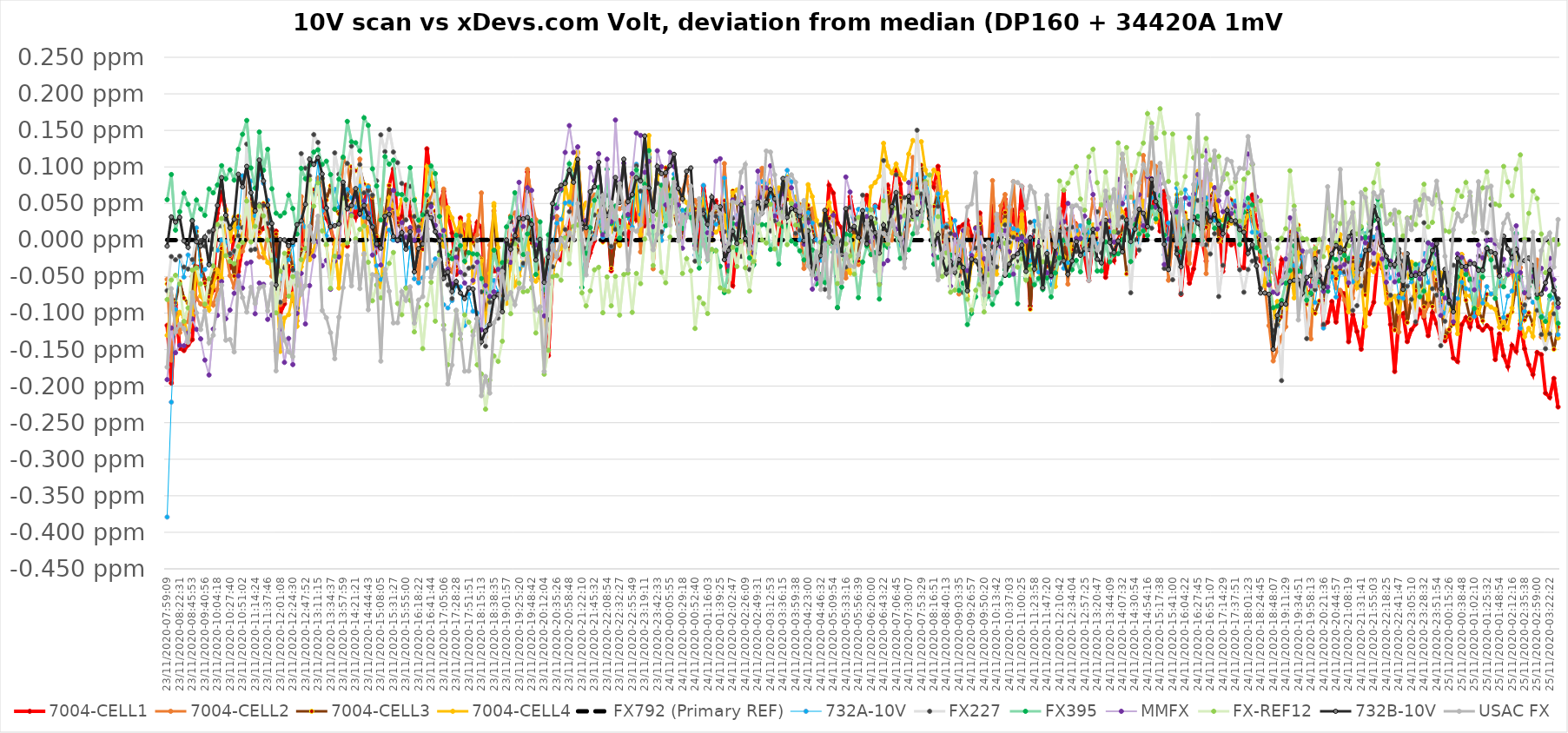
| Category | 7004-CELL1 | 7004-CELL2 | 7004-CELL3 | 7004-CELL4 | FX792 (Primary REF) | 732A-10V | FX227 | FX395 | MMFX | FX-REF12 | 732B-10V | USAC FX |
|---|---|---|---|---|---|---|---|---|---|---|---|---|
| 23/11/2020-07:59:09 | -0.117 | -0.054 | -0.06 | -0.131 | 0 | -0.379 | -0.069 | 0.055 | -0.191 | -0.081 | -0.008 | -0.174 |
| 23/11/2020-08:06:56 | -0.196 | -0.164 | -0.076 | -0.085 | 0 | -0.222 | -0.023 | 0.09 | -0.12 | -0.055 | 0.032 | -0.067 |
| 23/11/2020-08:14:44 | -0.088 | -0.097 | -0.086 | -0.113 | 0 | -0.095 | -0.027 | 0.014 | -0.154 | -0.048 | 0.025 | -0.126 |
| 23/11/2020-08:22:31 | -0.148 | -0.127 | -0.057 | -0.099 | 0 | -0.024 | -0.022 | 0.039 | -0.144 | -0.06 | 0.031 | -0.115 |
| 23/11/2020-08:30:19 | -0.151 | -0.113 | -0.079 | -0.106 | 0 | -0.051 | -0.037 | 0.064 | -0.145 | -0.111 | -0.001 | -0.122 |
| 23/11/2020-08:38:06 | -0.144 | -0.112 | -0.087 | -0.135 | 0 | -0.02 | -0.04 | 0.049 | -0.127 | -0.093 | -0.01 | -0.14 |
| 23/11/2020-08:45:53 | -0.136 | -0.05 | -0.085 | -0.103 | 0 | -0.03 | -0.027 | 0.027 | -0.108 | -0.041 | 0.026 | -0.072 |
| 23/11/2020-09:25:21 | -0.037 | -0.08 | 0.012 | -0.041 | 0 | 0.017 | 0.005 | 0.055 | -0.122 | -0.038 | -0.002 | -0.1 |
| 23/11/2020-09:33:08 | -0.036 | -0.087 | -0.028 | -0.077 | 0 | -0.049 | -0.001 | 0.042 | -0.135 | -0.06 | -0.008 | -0.123 |
| 23/11/2020-09:40:56 | -0.055 | -0.091 | -0.059 | -0.087 | 0 | -0.04 | -0.008 | 0.034 | -0.164 | -0.088 | 0.004 | -0.097 |
| 23/11/2020-09:48:43 | -0.083 | -0.078 | -0.078 | -0.096 | 0 | -0.032 | 0.011 | 0.07 | -0.185 | -0.053 | -0.034 | -0.141 |
| 23/11/2020-09:56:30 | -0.069 | -0.089 | -0.039 | -0.064 | 0 | -0.006 | -0.013 | 0.065 | -0.122 | -0.036 | 0.014 | -0.13 |
| 23/11/2020-10:04:18 | 0.037 | -0.068 | -0.051 | -0.041 | 0 | -0.014 | 0.018 | 0.075 | -0.103 | 0.021 | 0.047 | -0.082 |
| 23/11/2020-10:12:05 | 0.065 | -0.006 | -0.011 | -0.052 | 0 | 0 | 0.019 | 0.102 | -0.057 | 0.03 | 0.085 | -0.062 |
| 23/11/2020-10:19:53 | 0.04 | -0.016 | -0.022 | 0.041 | 0 | -0.002 | 0.028 | 0.084 | -0.108 | -0.022 | 0.034 | -0.137 |
| 23/11/2020-10:27:40 | -0.038 | -0.049 | -0.022 | -0.002 | 0 | -0.02 | -0.019 | 0.096 | -0.096 | -0.029 | 0.017 | -0.136 |
| 23/11/2020-10:35:27 | 0.004 | -0.065 | -0.049 | 0.031 | 0 | -0.016 | -0.015 | 0.082 | -0.073 | -0.032 | 0.028 | -0.153 |
| 23/11/2020-10:43:15 | -0.043 | -0.021 | 0.033 | -0.024 | 0 | 0.017 | 0.006 | 0.124 | -0.049 | -0.009 | 0.09 | -0.058 |
| 23/11/2020-10:51:02 | -0.008 | -0.015 | 0.004 | 0.025 | 0 | 0.088 | 0.017 | 0.145 | -0.066 | -0.003 | 0.073 | -0.079 |
| 23/11/2020-10:58:49 | 0.028 | 0.002 | 0.087 | 0.055 | 0 | 0.091 | 0.131 | 0.164 | -0.032 | 0.053 | 0.101 | -0.099 |
| 23/11/2020-11:06:37 | 0.044 | 0.057 | 0.056 | 0.041 | 0 | 0.081 | -0.014 | 0.099 | -0.03 | -0.003 | 0.065 | -0.065 |
| 23/11/2020-11:14:24 | 0.042 | 0 | 0.033 | 0.001 | 0 | 0.033 | -0.013 | 0.071 | -0.101 | 0.019 | 0.04 | -0.087 |
| 23/11/2020-11:22:12 | 0.01 | -0.023 | 0.011 | 0.002 | 0 | 0.089 | 0.049 | 0.148 | -0.059 | 0.046 | 0.109 | -0.066 |
| 23/11/2020-11:29:59 | 0.016 | -0.024 | 0.05 | -0.018 | 0 | 0.078 | 0.047 | 0.095 | -0.061 | 0.033 | 0.081 | -0.063 |
| 23/11/2020-11:37:46 | 0.023 | 0.012 | 0.045 | -0.031 | 0 | 0.054 | 0.023 | 0.124 | -0.109 | 0 | 0.048 | -0.097 |
| 23/11/2020-11:45:34 | -0.015 | -0.049 | -0.015 | -0.037 | 0 | 0 | 0.015 | 0.07 | -0.103 | -0.028 | 0.023 | -0.06 |
| 23/11/2020-11:53:21 | 0.012 | -0.031 | 0.008 | -0.05 | 0 | -0.028 | -0.066 | 0.037 | -0.152 | -0.1 | -0.061 | -0.179 |
| 23/11/2020-12:01:08 | -0.1 | -0.088 | -0.069 | -0.152 | 0 | -0.053 | -0.085 | 0.033 | -0.122 | -0.043 | 0.001 | -0.104 |
| 23/11/2020-12:08:56 | -0.087 | -0.083 | -0.036 | -0.107 | 0 | -0.04 | -0.038 | 0.037 | -0.168 | -0.018 | 0 | -0.137 |
| 23/11/2020-12:16:43 | -0.036 | -0.008 | -0.017 | -0.102 | 0 | -0.027 | -0.066 | 0.061 | -0.135 | -0.077 | -0.008 | -0.153 |
| 23/11/2020-12:24:30 | -0.083 | -0.035 | -0.038 | -0.074 | 0 | -0.007 | -0.041 | 0.043 | -0.17 | -0.05 | -0.003 | -0.16 |
| 23/11/2020-12:32:18 | -0.09 | -0.111 | -0.081 | -0.118 | 0 | -0.077 | -0.093 | 0.008 | -0.1 | -0.062 | 0.021 | -0.046 |
| 23/11/2020-12:40:05 | 0.018 | 0.059 | -0.012 | -0.037 | 0 | 0.031 | 0.118 | 0.098 | -0.046 | -0.027 | 0.026 | -0.074 |
| 23/11/2020-12:47:52 | -0.015 | -0.005 | -0.021 | -0.021 | 0 | 0.018 | 0.098 | 0.084 | -0.115 | -0.012 | 0.049 | -0.062 |
| 23/11/2020-12:55:40 | -0.017 | -0.022 | -0.026 | -0.027 | 0 | 0.019 | 0.088 | 0.102 | -0.062 | 0.083 | 0.111 | 0.019 |
| 23/11/2020-13:03:27 | 0.066 | 0.061 | 0.069 | -0.014 | 0 | 0.055 | 0.144 | 0.12 | -0.022 | 0.046 | 0.103 | -0.003 |
| 23/11/2020-13:11:15 | 0.066 | 0.085 | 0.073 | 0.024 | 0 | 0.107 | 0.134 | 0.123 | -0.002 | 0.078 | 0.113 | 0.033 |
| 23/11/2020-13:19:02 | 0.051 | 0.075 | 0.084 | 0.03 | 0 | 0.04 | 0.085 | 0.103 | -0.035 | 0.012 | 0.09 | -0.096 |
| 23/11/2020-13:26:49 | 0.03 | 0.036 | 0.055 | -0.007 | 0 | 0.006 | 0.044 | 0.108 | -0.028 | -0.006 | 0.044 | -0.106 |
| 23/11/2020-13:34:37 | 0.017 | 0.021 | 0.074 | -0.05 | 0 | 0.023 | 0.018 | 0.09 | -0.067 | -0.066 | 0.018 | -0.127 |
| 23/11/2020-13:42:24 | -0.006 | -0.013 | 0.042 | -0.002 | 0 | 0.069 | 0.119 | 0.042 | -0.029 | -0.022 | 0.02 | -0.162 |
| 23/11/2020-13:50:11 | 0.006 | -0.022 | 0.036 | -0.066 | 0 | 0.045 | 0.09 | 0.083 | -0.023 | 0.025 | 0.022 | -0.105 |
| 23/11/2020-13:57:59 | 0.069 | 0.111 | 0.061 | -0.007 | 0 | 0.038 | 0.075 | 0.113 | 0.063 | 0.057 | 0.079 | -0.065 |
| 23/11/2020-14:05:46 | -0.009 | 0.102 | 0.054 | -0.003 | 0 | 0.069 | 0.105 | 0.162 | 0.044 | -0.004 | 0.043 | -0.021 |
| 23/11/2020-14:13:33 | 0.048 | 0.067 | 0.1 | 0.043 | 0 | 0.058 | 0.128 | 0.134 | 0.035 | 0.033 | 0.047 | -0.063 |
| 23/11/2020-14:21:21 | 0.031 | 0.046 | 0.095 | 0.053 | 0 | 0.045 | 0.063 | 0.133 | 0.06 | 0.002 | 0.07 | -0.003 |
| 23/11/2020-14:29:08 | 0.06 | 0.111 | 0.098 | 0.084 | 0 | 0.074 | 0.103 | 0.122 | 0.035 | 0.015 | 0.036 | -0.066 |
| 23/11/2020-14:36:56 | 0.05 | 0.004 | 0.077 | -0.02 | 0 | 0.031 | 0.065 | 0.167 | 0.054 | 0.019 | 0.047 | -0.019 |
| 23/11/2020-14:44:43 | 0.074 | 0.046 | 0.074 | 0.017 | 0 | 0.072 | 0.067 | 0.157 | 0.037 | -0.03 | 0.03 | -0.095 |
| 23/11/2020-14:52:30 | 0.033 | 0.016 | 0.059 | 0.002 | 0 | 0.019 | 0.061 | 0.097 | -0.021 | -0.083 | 0.018 | -0.047 |
| 23/11/2020-15:00:18 | -0.015 | 0.006 | 0.004 | -0.047 | 0 | -0.035 | 0.081 | 0.074 | -0.008 | -0.061 | -0.005 | -0.049 |
| 23/11/2020-15:08:05 | -0.004 | 0.054 | -0.001 | -0.064 | 0 | -0.054 | 0.144 | 0.027 | -0.034 | -0.079 | -0.011 | -0.166 |
| 23/11/2020-15:15:52 | 0.01 | 0.024 | 0.034 | 0.007 | 0.001 | -0.046 | 0.121 | 0.114 | 0.022 | -0.047 | 0.033 | -0.04 |
| 23/11/2020-15:23:40 | 0.075 | 0.049 | 0.075 | 0.058 | 0 | 0.014 | 0.151 | 0.104 | 0.042 | -0.032 | 0.035 | -0.07 |
| 23/11/2020-15:31:27 | 0.097 | 0.033 | 0.043 | 0.047 | 0 | 0 | 0.12 | 0.109 | 0.068 | -0.017 | 0.005 | -0.113 |
| 23/11/2020-15:39:15 | 0.023 | 0.001 | 0.024 | 0.036 | 0 | -0.001 | 0.106 | 0.063 | -0.001 | -0.087 | 0 | -0.113 |
| 23/11/2020-15:47:12 | 0.033 | 0.003 | 0.013 | 0.055 | 0 | 0.006 | 0.077 | 0.062 | 0.024 | -0.102 | 0.01 | -0.071 |
| 23/11/2020-15:55:00 | 0.075 | 0.015 | 0.043 | 0.054 | 0 | -0.065 | 0.027 | 0.055 | 0.004 | -0.066 | -0.013 | -0.083 |
| 23/11/2020-16:02:47 | 0.033 | 0.003 | 0.059 | 0.069 | 0 | -0.01 | 0.073 | 0.099 | 0.017 | -0.083 | 0.011 | -0.064 |
| 23/11/2020-16:10:34 | 0.017 | 0.028 | 0.034 | 0.056 | -0.001 | -0.053 | 0.032 | 0.055 | 0 | -0.126 | -0.044 | -0.114 |
| 23/11/2020-16:18:22 | 0.009 | -0.058 | 0.001 | 0.024 | 0 | -0.059 | 0.018 | 0.027 | 0.013 | -0.092 | -0.012 | -0.082 |
| 23/11/2020-16:26:09 | 0.038 | 0.022 | -0.013 | 0.01 | 0 | -0.052 | 0.003 | 0.034 | 0.002 | -0.149 | -0.005 | -0.077 |
| 23/11/2020-16:33:56 | 0.125 | 0.031 | 0.054 | 0.101 | 0 | -0.038 | 0.039 | 0.062 | 0.015 | -0.089 | 0.034 | 0.03 |
| 23/11/2020-16:41:44 | 0.077 | 0.057 | 0.038 | 0.091 | 0 | -0.036 | 0.049 | 0.101 | 0.046 | -0.058 | 0.03 | -0.051 |
| 23/11/2020-16:49:31 | 0.064 | 0.078 | 0.04 | 0.05 | 0 | -0.026 | 0.068 | 0.091 | 0.02 | -0.111 | 0.011 | -0.033 |
| 23/11/2020-16:57:18 | 0.049 | 0.026 | -0.005 | 0.043 | 0 | -0.037 | -0.017 | 0.032 | 0.006 | -0.02 | -0.001 | -0.027 |
| 23/11/2020-17:05:06 | 0.067 | 0.07 | 0.011 | -0.008 | -0.001 | -0.088 | -0.042 | 0.006 | 0.013 | -0.116 | -0.052 | -0.123 |
| 23/11/2020-17:12:53 | 0.035 | -0.034 | -0.031 | 0.044 | 0 | -0.093 | -0.061 | -0.021 | -0.04 | -0.171 | -0.044 | -0.197 |
| 23/11/2020-17:20:41 | 0.01 | -0.043 | -0.016 | 0.03 | 0 | -0.083 | -0.08 | -0.026 | -0.06 | -0.13 | -0.07 | -0.171 |
| 23/11/2020-17:28:28 | -0.047 | -0.018 | -0.036 | 0.012 | 0 | -0.063 | -0.013 | 0.006 | -0.024 | -0.097 | -0.057 | -0.096 |
| 23/11/2020-17:36:16 | 0.03 | 0.014 | 0.005 | 0.024 | 0 | -0.064 | 0.006 | -0.008 | -0.044 | -0.136 | -0.072 | -0.128 |
| 23/11/2020-17:44:03 | -0.004 | 0.021 | -0.031 | -0.011 | 0 | -0.117 | -0.047 | -0.029 | -0.059 | -0.103 | -0.08 | -0.179 |
| 23/11/2020-17:51:51 | 0.025 | 0.001 | 0.023 | 0.034 | 0 | -0.074 | -0.038 | -0.017 | -0.066 | -0.112 | -0.066 | -0.179 |
| 23/11/2020-17:59:38 | -0.003 | 0.001 | -0.003 | -0.058 | 0 | -0.098 | -0.037 | -0.019 | -0.055 | -0.125 | -0.067 | -0.131 |
| 23/11/2020-18:07:25 | 0.024 | 0.007 | -0.016 | -0.037 | 0 | -0.1 | -0.001 | -0.02 | -0.03 | -0.171 | -0.108 | -0.107 |
| 23/11/2020-18:15:13 | 0.017 | 0.064 | -0.026 | -0.029 | 0 | -0.122 | -0.071 | -0.053 | -0.123 | -0.183 | -0.139 | -0.213 |
| 23/11/2020-18:23:00 | -0.071 | -0.072 | -0.102 | -0.133 | 0 | -0.12 | -0.145 | -0.07 | -0.062 | -0.232 | -0.124 | -0.187 |
| 23/11/2020-18:30:48 | -0.028 | -0.007 | -0.07 | -0.046 | 0 | -0.096 | -0.085 | -0.078 | -0.077 | -0.192 | -0.116 | -0.21 |
| 23/11/2020-18:38:35 | -0.042 | 0.04 | 0.046 | 0.05 | 0 | -0.055 | -0.078 | -0.014 | -0.071 | -0.159 | -0.078 | -0.113 |
| 23/11/2020-18:46:23 | -0.044 | -0.037 | -0.049 | -0.01 | 0 | -0.071 | -0.107 | -0.041 | -0.04 | -0.166 | -0.074 | -0.102 |
| 23/11/2020-18:54:10 | -0.043 | -0.036 | -0.081 | -0.068 | 0 | -0.082 | -0.037 | -0.031 | -0.069 | -0.139 | -0.098 | -0.043 |
| 23/11/2020-19:01:57 | -0.04 | -0.033 | -0.074 | -0.087 | 0 | -0.04 | -0.036 | 0.018 | -0.003 | -0.029 | 0 | -0.08 |
| 23/11/2020-19:09:45 | 0.033 | 0.033 | 0 | -0.026 | 0 | 0.02 | 0.025 | 0.031 | -0.031 | -0.101 | -0.013 | -0.072 |
| 23/11/2020-19:17:32 | -0.019 | 0.037 | -0.027 | -0.062 | 0 | -0.014 | -0.006 | 0.065 | 0.014 | -0.005 | 0.006 | -0.089 |
| 23/11/2020-19:25:20 | 0.025 | -0.001 | -0.008 | -0.049 | 0.001 | -0.04 | 0 | 0.029 | 0.079 | -0.059 | 0.03 | -0.066 |
| 23/11/2020-19:33:07 | 0.037 | 0.028 | -0.03 | -0.028 | 0 | -0.034 | -0.032 | -0.02 | 0.019 | -0.071 | 0.029 | -0.065 |
| 23/11/2020-19:40:54 | 0.093 | 0.097 | 0.03 | 0.006 | 0 | 0.04 | 0.067 | 0.008 | 0.072 | -0.07 | 0.031 | -0.019 |
| 23/11/2020-19:48:42 | 0.041 | 0.056 | -0.004 | -0.05 | 0 | 0.027 | 0.02 | 0.027 | 0.068 | -0.065 | 0.021 | -0.054 |
| 23/11/2020-19:56:29 | -0.003 | 0.028 | -0.019 | -0.056 | 0 | -0.004 | -0.016 | -0.047 | -0.007 | -0.127 | -0.027 | -0.096 |
| 23/11/2020-20:04:17 | -0.012 | -0.013 | -0.052 | -0.044 | 0 | -0.002 | -0.016 | 0.025 | -0.012 | -0.098 | 0.001 | -0.091 |
| 23/11/2020-20:12:04 | -0.032 | -0.078 | -0.079 | -0.135 | 0 | -0.096 | -0.148 | -0.068 | -0.104 | -0.184 | -0.058 | -0.18 |
| 23/11/2020-20:19:51 | -0.158 | -0.053 | -0.114 | -0.079 | 0 | -0.043 | -0.109 | 0.007 | -0.014 | -0.151 | -0.023 | -0.06 |
| 23/11/2020-20:27:39 | -0.04 | -0.04 | -0.046 | -0.048 | 0 | -0.006 | -0.037 | 0.034 | 0.03 | -0.05 | 0.05 | -0.007 |
| 23/11/2020-20:35:26 | -0.023 | 0.032 | -0.017 | -0.019 | 0 | 0.023 | -0.022 | 0.048 | 0.044 | -0.049 | 0.067 | -0.022 |
| 23/11/2020-20:43:13 | -0.027 | -0.002 | -0.009 | -0.011 | 0 | 0.028 | 0.002 | 0.068 | 0.07 | -0.055 | 0.075 | 0.001 |
| 23/11/2020-20:51:01 | -0.003 | 0.017 | -0.004 | 0.078 | 0 | 0.051 | 0.014 | 0.079 | 0.12 | 0.003 | 0.077 | -0.009 |
| 23/11/2020-20:58:48 | 0.017 | 0.001 | -0.015 | 0.048 | 0.001 | 0.052 | 0.039 | 0.104 | 0.157 | -0.032 | 0.095 | 0.01 |
| 23/11/2020-21:06:35 | 0.082 | 0.067 | 0.012 | 0.098 | 0 | 0.049 | 0.016 | 0.086 | 0.12 | 0.019 | 0.079 | 0.001 |
| 23/11/2020-21:14:23 | 0.04 | 0.119 | 0.045 | 0.121 | 0 | 0.089 | 0.1 | 0.098 | 0.127 | 0.021 | 0.11 | 0.05 |
| 23/11/2020-21:22:10 | 0.008 | 0.047 | 0.006 | 0.036 | 0 | -0.044 | 0.015 | -0.065 | 0.026 | -0.072 | 0.023 | 0 |
| 23/11/2020-21:29:58 | -0.036 | -0.004 | -0.017 | 0.051 | 0 | -0.017 | -0.011 | -0.018 | 0.027 | -0.09 | 0.017 | -0.048 |
| 23/11/2020-21:37:45 | -0.018 | 0.057 | -0.001 | 0.047 | 0 | 0.019 | 0.011 | 0.017 | 0.099 | -0.069 | 0.066 | -0.005 |
| 23/11/2020-21:45:32 | -0.001 | 0.062 | 0.01 | 0.05 | 0 | 0.005 | 0.034 | 0.054 | 0.081 | -0.041 | 0.073 | 0.002 |
| 23/11/2020-21:53:20 | 0.032 | 0.066 | 0.04 | 0.024 | 0 | 0.025 | 0.059 | 0.072 | 0.118 | -0.037 | 0.106 | 0.033 |
| 23/11/2020-22:01:07 | 0.005 | 0.061 | -0.003 | 0.002 | 0 | 0.004 | 0.021 | 0.01 | 0.007 | -0.1 | 0.05 | 0.061 |
| 23/11/2020-22:08:54 | 0.047 | 0.06 | 0.034 | 0.04 | 0 | 0.013 | 0.061 | 0.097 | 0.111 | -0.051 | 0.034 | 0.006 |
| 23/11/2020-22:16:52 | -0.042 | 0.017 | -0.039 | 0.012 | 0 | -0.009 | -0.009 | 0.022 | 0.025 | -0.09 | 0.045 | 0.051 |
| 23/11/2020-22:24:39 | 0.014 | 0.043 | 0 | 0.033 | 0 | 0.029 | 0.015 | 0.046 | 0.164 | -0.05 | 0.086 | 0.029 |
| 23/11/2020-22:32:27 | 0.026 | 0.043 | -0.008 | -0.006 | 0 | 0.004 | 0.016 | 0.003 | 0.079 | -0.103 | 0.051 | 0.077 |
| 23/11/2020-22:40:14 | 0.018 | 0.047 | 0.021 | 0.029 | 0 | 0.044 | 0.009 | 0.032 | 0.105 | -0.047 | 0.111 | 0.043 |
| 23/11/2020-22:48:02 | -0.006 | 0.061 | 0.051 | 0.018 | 0 | 0.03 | 0.051 | 0.033 | 0.035 | -0.045 | 0.052 | -0.041 |
| 23/11/2020-22:55:49 | 0.052 | 0.086 | 0.062 | 0.015 | 0 | 0.018 | 0.063 | 0.061 | 0.091 | -0.099 | 0.062 | 0.014 |
| 23/11/2020-23:03:36 | 0.028 | 0.068 | 0.069 | 0.089 | 0 | 0.104 | 0.101 | 0.096 | 0.146 | -0.046 | 0.085 | 0.012 |
| 23/11/2020-23:11:24 | 0.035 | -0.016 | 0.037 | 0.007 | 0 | 0.035 | 0.067 | 0.082 | 0.143 | -0.06 | 0.081 | 0.021 |
| 23/11/2020-23:19:11 | 0.019 | 0.061 | 0.084 | 0.087 | 0 | 0.125 | 0.101 | 0.076 | 0.093 | 0.001 | 0.142 | 0.072 |
| 23/11/2020-23:26:58 | 0.095 | 0.098 | 0.118 | 0.143 | 0 | 0.114 | 0.112 | 0.122 | 0.108 | 0.027 | 0.071 | 0.008 |
| 23/11/2020-23:34:46 | 0.002 | -0.039 | 0.02 | 0 | 0 | 0.011 | 0.005 | -0.013 | 0.018 | -0.035 | 0.04 | -0.013 |
| 23/11/2020-23:42:33 | 0.036 | 0.037 | 0.032 | 0.088 | 0 | 0.069 | 0.078 | 0.027 | 0.122 | 0.035 | 0.101 | 0.008 |
| 23/11/2020-23:50:21 | 0.039 | 0.008 | 0.025 | 0.028 | 0 | 0 | 0.011 | 0.075 | 0.1 | -0.044 | 0.091 | 0.063 |
| 23/11/2020-23:58:08 | 0.046 | 0.085 | 0.099 | 0.077 | 0 | 0.024 | 0.032 | 0.02 | 0.048 | -0.059 | 0.092 | 0.082 |
| 24/11/2020-00:05:55 | 0.031 | 0.059 | 0.061 | 0.057 | 0 | 0.061 | 0.044 | 0.06 | 0.12 | 0.004 | 0.102 | 0.02 |
| 24/11/2020-00:13:43 | 0.051 | 0.065 | 0.035 | 0.071 | 0 | 0.09 | 0.056 | 0.084 | 0.1 | 0.052 | 0.117 | 0.079 |
| 24/11/2020-00:21:30 | 0.013 | 0.048 | 0.013 | 0.065 | 0 | 0.015 | 0.04 | 0.046 | 0.048 | 0.011 | 0.071 | -0.001 |
| 24/11/2020-00:29:18 | 0.006 | 0.068 | 0.003 | 0.059 | 0 | 0.041 | 0.02 | 0.016 | -0.011 | -0.046 | 0.056 | 0.034 |
| 24/11/2020-00:37:05 | 0.039 | 0.087 | 0.037 | 0.051 | 0 | 0.033 | 0.036 | 0.041 | 0.035 | -0.025 | 0.094 | 0.031 |
| 24/11/2020-00:44:52 | 0.054 | 0.047 | 0.037 | 0.041 | 0 | 0.035 | 0.066 | 0.031 | 0.059 | -0.042 | 0.099 | 0.074 |
| 24/11/2020-00:52:40 | 0.008 | 0.054 | 0.043 | 0.026 | 0 | -0.021 | -0.029 | -0.006 | -0.008 | -0.121 | 0.009 | -0.012 |
| 24/11/2020-01:00:27 | -0.018 | 0.038 | -0.03 | 0.03 | 0 | 0.03 | -0.023 | -0.038 | 0.035 | -0.079 | 0.036 | 0.056 |
| 24/11/2020-01:08:15 | 0.074 | 0.063 | 0.027 | 0.056 | 0 | 0.075 | 0.041 | 0.033 | 0.036 | -0.087 | 0.036 | -0.006 |
| 24/11/2020-01:16:03 | 0.033 | 0.015 | 0.006 | 0.033 | 0 | 0.013 | 0.001 | -0.028 | 0.01 | -0.101 | 0.021 | -0.027 |
| 24/11/2020-01:23:50 | 0.048 | 0.01 | 0 | 0.009 | 0 | 0.033 | 0.026 | -0.016 | 0.009 | -0.013 | 0.059 | 0.036 |
| 24/11/2020-01:31:37 | 0.053 | 0.037 | 0.043 | 0.011 | 0 | 0.021 | 0.032 | -0.014 | 0.108 | -0.015 | 0.045 | 0.046 |
| 24/11/2020-01:39:25 | 0.016 | 0.026 | 0.018 | 0.016 | 0 | 0.032 | 0.039 | -0.036 | 0.111 | -0.065 | 0.045 | 0.036 |
| 24/11/2020-01:47:12 | -0.011 | 0.105 | 0.054 | 0.033 | 0 | 0.085 | 0.011 | -0.072 | -0.008 | -0.069 | -0.027 | -0.012 |
| 24/11/2020-01:55:00 | -0.057 | 0.024 | 0.01 | -0.013 | 0 | -0.003 | -0.023 | -0.042 | -0.035 | -0.07 | -0.014 | -0.005 |
| 24/11/2020-02:02:47 | -0.062 | 0.016 | 0.067 | 0.064 | 0 | 0.031 | 0.03 | 0.023 | 0.055 | -0.01 | 0.012 | 0.052 |
| 24/11/2020-02:10:34 | 0.003 | 0.019 | 0.051 | 0.069 | 0 | 0.033 | -0.01 | -0.014 | 0.022 | -0.036 | -0.005 | 0.051 |
| 24/11/2020-02:18:22 | -0.018 | 0.015 | 0.001 | 0.051 | 0 | 0.038 | -0.022 | 0.047 | 0.072 | -0.002 | 0.048 | 0.093 |
| 24/11/2020-02:26:09 | 0.032 | 0.015 | 0.058 | 0.03 | 0 | 0.037 | 0.056 | 0.011 | 0.051 | -0.038 | 0.002 | 0.104 |
| 24/11/2020-02:33:56 | 0.012 | -0.035 | -0.002 | -0.017 | 0 | 0.005 | -0.04 | -0.024 | 0.008 | -0.07 | -0.008 | -0.012 |
| 24/11/2020-02:41:44 | -0.004 | -0.029 | -0.02 | -0.027 | 0 | 0.024 | -0.033 | -0.034 | -0.018 | -0.03 | 0.042 | 0.052 |
| 24/11/2020-02:49:31 | 0.046 | 0.059 | 0.048 | 0.045 | 0 | 0.078 | 0.028 | 0.011 | 0.094 | 0.023 | 0.052 | 0.025 |
| 24/11/2020-02:57:18 | 0.045 | 0.098 | 0.072 | 0.052 | 0 | 0.08 | 0.062 | 0.021 | 0.058 | 0 | 0.037 | 0.037 |
| 24/11/2020-03:05:06 | 0.064 | 0.068 | 0.05 | 0.072 | 0 | 0.076 | 0.047 | 0.021 | 0.071 | -0.004 | 0.052 | 0.122 |
| 24/11/2020-03:12:53 | 0.03 | 0.038 | 0.06 | 0.081 | 0 | 0.06 | 0.013 | -0.013 | 0.102 | 0.049 | 0.069 | 0.12 |
| 24/11/2020-03:20:41 | 0.058 | 0.06 | 0.063 | 0.065 | 0 | 0.036 | 0.026 | 0.003 | 0.033 | -0.012 | 0.056 | 0.089 |
| 24/11/2020-03:28:28 | -0.005 | 0.065 | 0.053 | 0.071 | 0 | 0.06 | 0.023 | -0.033 | 0.024 | 0.022 | 0.044 | 0.037 |
| 24/11/2020-03:36:15 | 0.032 | 0.031 | 0.047 | 0.066 | 0 | 0.077 | 0.042 | 0.019 | 0.063 | 0.038 | 0.084 | 0.03 |
| 24/11/2020-03:44:03 | 0.013 | 0.066 | 0.056 | 0.086 | 0 | 0.095 | 0.02 | 0.018 | 0.084 | -0.006 | 0.031 | 0.083 |
| 24/11/2020-03:51:50 | 0.028 | 0.053 | 0.052 | 0.05 | 0 | 0.08 | 0.034 | -0.001 | 0.071 | 0.05 | 0.043 | 0.089 |
| 24/11/2020-03:59:38 | 0.007 | 0.004 | 0.028 | 0.059 | 0 | 0.05 | 0.009 | -0.005 | 0.047 | 0.02 | 0.041 | 0.079 |
| 24/11/2020-04:07:25 | 0.046 | 0.022 | 0.049 | 0.046 | 0 | 0 | 0.013 | -0.015 | 0.036 | 0.02 | 0.032 | 0.039 |
| 24/11/2020-04:15:12 | -0.005 | -0.039 | 0.016 | 0.012 | 0 | 0.02 | -0.001 | -0.027 | -0.006 | 0.029 | -0.001 | 0.054 |
| 24/11/2020-04:23:00 | 0.023 | 0.006 | 0.048 | 0.076 | 0 | 0.037 | 0.028 | 0.014 | 0.024 | 0.013 | 0.012 | -0.035 |
| 24/11/2020-04:30:47 | -0.004 | 0.043 | 0.012 | 0.059 | 0 | 0.023 | -0.002 | -0.014 | -0.067 | -0.042 | -0.047 | -0.048 |
| 24/11/2020-04:38:34 | -0.052 | 0.001 | 0 | 0.027 | 0 | 0 | -0.031 | -0.06 | -0.053 | -0.038 | -0.031 | -0.016 |
| 24/11/2020-04:46:32 | 0.006 | -0.006 | -0.009 | 0.013 | 0 | -0.028 | 0.021 | -0.047 | -0.003 | -0.003 | -0.021 | -0.068 |
| 24/11/2020-04:54:19 | -0.009 | -0.025 | 0.006 | 0.037 | 0 | -0.004 | -0.068 | -0.058 | 0.001 | 0.021 | 0.041 | -0.006 |
| 24/11/2020-05:02:07 | 0.075 | -0.008 | 0.029 | 0.051 | 0 | 0.016 | -0.004 | 0.013 | 0.019 | -0.003 | 0.013 | -0.078 |
| 24/11/2020-05:09:54 | 0.064 | -0.001 | 0.037 | 0.027 | 0 | 0.009 | 0.013 | -0.017 | 0.034 | 0.004 | -0.003 | -0.011 |
| 24/11/2020-05:17:42 | 0.023 | -0.034 | 0 | -0.006 | 0 | -0.015 | -0.093 | -0.092 | -0.05 | -0.06 | -0.003 | 0.002 |
| 24/11/2020-05:25:29 | 0.017 | -0.003 | -0.022 | -0.008 | 0 | -0.012 | -0.001 | -0.065 | -0.021 | -0.017 | -0.019 | -0.058 |
| 24/11/2020-05:33:16 | -0.032 | -0.052 | -0.035 | -0.038 | 0 | -0.006 | -0.037 | 0.008 | 0.086 | -0.005 | 0.043 | -0.02 |
| 24/11/2020-05:41:04 | 0.059 | -0.024 | -0.027 | -0.045 | 0 | 0.033 | 0.045 | 0.007 | 0.066 | -0.022 | 0.014 | -0.035 |
| 24/11/2020-05:48:51 | 0.032 | -0.006 | 0.023 | 0.004 | 0 | 0.025 | 0.028 | -0.031 | 0.016 | -0.047 | 0.019 | -0.036 |
| 24/11/2020-05:56:39 | 0.022 | -0.034 | -0.029 | 0 | 0 | 0.042 | 0.008 | -0.079 | 0.01 | 0.031 | 0.004 | -0.02 |
| 24/11/2020-06:04:26 | 0.037 | 0.041 | 0.039 | 0.05 | 0 | 0.051 | 0.061 | -0.03 | 0.03 | 0.032 | 0.04 | -0.001 |
| 24/11/2020-06:12:13 | 0.061 | 0.006 | 0.009 | 0.008 | 0 | 0.042 | 0.002 | -0.008 | 0.032 | 0.001 | -0.005 | 0.023 |
| 24/11/2020-06:20:00 | 0.03 | -0.02 | 0.026 | 0.073 | 0 | 0.026 | 0.011 | -0.02 | -0.002 | 0.041 | 0.03 | 0.008 |
| 24/11/2020-06:27:48 | 0.047 | 0.001 | 0.013 | 0.079 | 0 | 0.046 | 0.029 | -0.017 | 0.004 | 0.023 | 0.01 | -0.043 |
| 24/11/2020-06:35:35 | 0.045 | -0.016 | 0.007 | 0.087 | 0 | -0.005 | -0.046 | -0.081 | -0.06 | -0.061 | -0.018 | 0.011 |
| 24/11/2020-06:43:22 | 0.069 | -0.004 | 0.04 | 0.132 | 0 | 0.06 | 0.109 | -0.007 | -0.032 | 0.054 | 0.021 | 0.009 |
| 24/11/2020-06:51:10 | 0.075 | 0.059 | 0.065 | 0.102 | 0 | 0.021 | 0.023 | -0.01 | -0.028 | -0.005 | 0.009 | 0 |
| 24/11/2020-06:58:57 | 0.05 | 0 | 0.033 | 0.092 | 0 | 0.035 | 0.04 | 0.023 | 0.038 | 0.02 | 0.046 | 0.027 |
| 24/11/2020-07:06:45 | 0.098 | 0.037 | 0.075 | 0.104 | 0 | 0.061 | 0.089 | 0.007 | 0.015 | 0.044 | 0.065 | 0.008 |
| 24/11/2020-07:14:32 | 0.077 | 0.052 | 0.058 | 0.09 | 0 | -0.007 | 0.015 | -0.025 | 0.031 | 0.008 | 0 | 0.002 |
| 24/11/2020-07:22:19 | 0.019 | -0.019 | 0.043 | 0.083 | 0 | 0.023 | 0.058 | -0.009 | -0.018 | 0.033 | -0.025 | -0.038 |
| 24/11/2020-07:30:07 | 0.049 | 0.02 | 0.049 | 0.118 | 0 | 0.051 | 0.027 | -0.013 | 0.079 | 0.059 | 0.06 | 0.046 |
| 24/11/2020-07:37:54 | 0.084 | 0.113 | 0.07 | 0.136 | 0 | 0.082 | 0.058 | 0.008 | 0.058 | 0.029 | 0.032 | 0.046 |
| 24/11/2020-07:45:42 | 0.057 | 0.049 | 0.071 | 0.133 | 0 | 0.09 | 0.15 | 0.035 | 0.035 | 0.065 | 0.037 | 0.01 |
| 24/11/2020-07:53:29 | 0.057 | 0.067 | 0.103 | 0.135 | 0 | 0.049 | 0.063 | 0.02 | 0.05 | 0.026 | 0.04 | 0.03 |
| 24/11/2020-08:01:16 | 0.081 | 0.068 | 0.057 | 0.096 | 0 | 0.085 | 0.062 | 0.058 | 0.058 | 0.08 | 0.062 | 0.077 |
| 24/11/2020-08:09:04 | 0.084 | 0.015 | 0.043 | 0.077 | 0 | 0.061 | 0.029 | 0.03 | 0.06 | 0.089 | 0.03 | 0.046 |
| 24/11/2020-08:16:51 | 0.072 | 0.038 | 0.046 | 0.096 | 0 | 0.023 | 0.007 | -0.033 | -0.021 | -0.011 | -0.007 | -0.013 |
| 24/11/2020-08:24:39 | 0.101 | 0.08 | 0.062 | 0.091 | 0 | 0.063 | 0.046 | -0.024 | 0.004 | 0.032 | 0.007 | -0.055 |
| 24/11/2020-08:32:26 | 0.041 | 0.015 | -0.003 | 0.055 | 0 | 0.019 | -0.036 | -0.032 | -0.047 | -0.05 | -0.025 | -0.018 |
| 24/11/2020-08:40:13 | -0.009 | 0.021 | 0.019 | 0.065 | 0 | 0.02 | 0.018 | -0.04 | -0.004 | -0.018 | -0.045 | 0.006 |
| 24/11/2020-08:48:00 | 0.029 | -0.021 | 0.007 | 0.023 | 0 | 0.009 | 0.009 | -0.021 | -0.063 | -0.071 | -0.03 | -0.044 |
| 24/11/2020-08:55:48 | -0.008 | -0.034 | -0.014 | -0.013 | 0 | 0.026 | -0.04 | -0.035 | 0.007 | -0.069 | -0.044 | -0.039 |
| 24/11/2020-09:03:35 | 0.017 | -0.074 | -0.031 | -0.014 | 0 | -0.007 | -0.048 | -0.069 | -0.035 | -0.037 | -0.027 | -0.001 |
| 24/11/2020-09:11:23 | 0.021 | -0.003 | 0.009 | 0.013 | 0 | -0.003 | -0.072 | -0.059 | 0.013 | -0.037 | -0.038 | -0.007 |
| 24/11/2020-09:19:10 | 0.026 | 0.015 | -0.042 | -0.077 | 0 | -0.07 | -0.069 | -0.116 | -0.042 | -0.081 | -0.069 | 0.045 |
| 24/11/2020-09:26:57 | 0.006 | -0.017 | -0.027 | -0.033 | 0 | -0.018 | -0.026 | -0.1 | -0.021 | -0.096 | -0.026 | 0.049 |
| 24/11/2020-09:34:45 | -0.014 | -0.014 | 0.017 | -0.02 | 0 | 0.015 | -0.011 | -0.078 | 0.017 | -0.069 | -0.029 | 0.092 |
| 24/11/2020-09:42:32 | 0.037 | 0.03 | 0.023 | -0.019 | 0 | -0.002 | 0.009 | -0.042 | 0.01 | -0.061 | -0.041 | -0.047 |
| 24/11/2020-09:50:20 | -0.036 | -0.064 | -0.014 | -0.044 | 0 | -0.014 | -0.008 | -0.088 | -0.026 | -0.098 | -0.058 | -0.075 |
| 24/11/2020-09:58:07 | -0.074 | -0.01 | -0.052 | -0.056 | 0 | -0.018 | -0.067 | -0.077 | -0.039 | -0.048 | -0.014 | -0.003 |
| 24/11/2020-10:05:54 | 0.046 | 0.081 | -0.01 | -0.01 | 0 | 0.006 | -0.01 | -0.088 | -0.028 | -0.042 | -0.03 | -0.075 |
| 24/11/2020-10:13:42 | -0.01 | -0.015 | -0.036 | -0.047 | 0 | -0.018 | -0.037 | -0.071 | 0.022 | 0.002 | -0.006 | 0.035 |
| 24/11/2020-10:21:29 | 0.036 | 0.047 | 0.007 | 0.02 | 0 | 0.001 | 0.014 | -0.06 | -0.009 | 0.013 | 0.004 | 0.007 |
| 24/11/2020-10:29:16 | 0.056 | 0.062 | 0.038 | 0.026 | 0 | 0.011 | 0.021 | -0.041 | 0.013 | -0.004 | -0.048 | -0.046 |
| 24/11/2020-10:37:03 | 0.013 | 0.004 | 0 | -0.025 | 0 | 0.021 | -0.003 | -0.049 | -0.016 | -0.035 | -0.033 | 0.045 |
| 24/11/2020-10:44:51 | 0.041 | 0.08 | 0.01 | 0.009 | 0 | 0.016 | 0.004 | -0.037 | -0.047 | -0.024 | -0.023 | 0.08 |
| 24/11/2020-10:52:38 | -0.009 | 0.001 | 0.008 | -0.008 | 0 | 0.013 | -0.03 | -0.087 | 0.001 | -0.037 | -0.019 | 0.079 |
| 24/11/2020-11:00:25 | 0.073 | 0.038 | 0.022 | 0.035 | 0 | -0.002 | 0.005 | 0.002 | 0.003 | -0.026 | -0.007 | 0.073 |
| 24/11/2020-11:08:13 | 0.005 | -0.008 | 0.002 | -0.036 | 0 | -0.027 | -0.001 | -0.053 | -0.002 | -0.055 | -0.043 | 0.043 |
| 24/11/2020-11:16:10 | -0.09 | -0.08 | -0.095 | -0.047 | 0 | -0.028 | 0.024 | -0.036 | 0.004 | -0.04 | 0.003 | 0.073 |
| 24/11/2020-11:23:58 | 0.008 | -0.035 | -0.015 | -0.015 | 0 | 0.026 | 0.012 | -0.061 | -0.02 | -0.032 | -0.04 | 0.065 |
| 24/11/2020-11:31:45 | -0.034 | 0.025 | -0.019 | -0.042 | 0 | -0.044 | -0.004 | -0.052 | -0.003 | 0.043 | -0.009 | 0.021 |
| 24/11/2020-11:39:32 | -0.011 | -0.018 | -0.028 | -0.06 | 0 | -0.034 | -0.065 | -0.068 | -0.023 | -0.03 | -0.065 | 0.004 |
| 24/11/2020-11:47:20 | -0.029 | -0.028 | -0.036 | 0.005 | 0 | -0.016 | 0.032 | -0.052 | -0.045 | -0.019 | -0.018 | 0.061 |
| 24/11/2020-11:55:07 | -0.005 | -0.026 | 0.014 | -0.045 | 0 | -0.061 | -0.041 | -0.078 | -0.05 | -0.032 | -0.049 | 0.017 |
| 24/11/2020-12:02:54 | -0.035 | -0.01 | -0.042 | -0.064 | 0 | -0.045 | -0.029 | -0.045 | -0.018 | -0.006 | -0.01 | -0.009 |
| 24/11/2020-12:10:42 | 0.014 | -0.023 | 0.022 | -0.005 | 0 | -0.001 | -0.031 | -0.024 | 0.025 | 0.081 | 0.012 | 0.043 |
| 24/11/2020-12:18:29 | 0.068 | 0.007 | -0.004 | -0.023 | 0 | -0.039 | 0.025 | 0 | 0.025 | 0.068 | -0.028 | 0.011 |
| 24/11/2020-12:26:16 | -0.026 | -0.06 | -0.034 | -0.046 | 0 | -0.031 | 0.015 | -0.005 | 0.05 | 0.078 | -0.047 | -0.006 |
| 24/11/2020-12:34:04 | 0.012 | 0.033 | -0.013 | 0.011 | 0 | -0.035 | 0.018 | -0.041 | 0.045 | 0.092 | -0.029 | 0.046 |
| 24/11/2020-12:41:51 | 0.021 | 0.02 | 0.004 | 0.013 | 0 | 0.013 | -0.016 | -0.028 | 0.002 | 0.1 | -0.002 | 0.047 |
| 24/11/2020-12:49:38 | -0.001 | 0.007 | 0 | -0.003 | 0 | 0.02 | 0.001 | -0.044 | 0.002 | 0.056 | -0.021 | 0.043 |
| 24/11/2020-12:57:25 | -0.022 | -0.001 | -0.01 | -0.008 | 0 | -0.019 | 0.01 | 0.009 | 0.033 | 0.041 | -0.012 | 0.012 |
| 24/11/2020-13:05:13 | -0.055 | 0.017 | -0.007 | 0.002 | 0 | 0.011 | 0.027 | 0.024 | 0.093 | 0.114 | -0.013 | -0.056 |
| 24/11/2020-13:13:00 | 0.003 | 0.056 | -0.013 | 0.02 | 0 | 0.009 | -0.001 | -0.004 | 0.062 | 0.124 | 0.015 | 0.005 |
| 24/11/2020-13:20:47 | 0.006 | 0.021 | 0.004 | 0.008 | 0 | -0.005 | 0.039 | -0.042 | 0.015 | 0.078 | -0.026 | -0.014 |
| 24/11/2020-13:28:35 | 0.003 | 0.057 | 0.023 | 0.022 | 0 | -0.01 | -0.018 | -0.042 | 0.023 | 0.048 | -0.031 | 0 |
| 24/11/2020-13:36:22 | -0.051 | 0.036 | 0.006 | 0.016 | 0 | 0.018 | 0.011 | -0.003 | 0.055 | 0.093 | 0.027 | 0.067 |
| 24/11/2020-13:44:09 | -0.019 | 0.032 | 0.017 | 0.037 | 0 | 0.011 | -0.02 | -0.03 | 0.026 | 0.058 | -0.003 | 0.042 |
| 24/11/2020-13:51:57 | -0.028 | 0.031 | -0.004 | 0.019 | 0 | 0.022 | -0.001 | -0.02 | -0.003 | 0.011 | -0.017 | 0.069 |
| 24/11/2020-13:59:44 | 0.017 | 0.047 | 0.038 | 0.053 | 0 | 0.058 | 0.01 | -0.019 | 0.083 | 0.133 | -0.001 | 0.019 |
| 24/11/2020-14:07:32 | 0 | 0.111 | 0.007 | 0.038 | 0 | 0.049 | 0.031 | 0 | 0.05 | 0.11 | -0.016 | 0.118 |
| 24/11/2020-14:15:19 | 0.041 | 0.088 | -0.046 | 0.025 | 0 | 0.059 | 0.01 | 0.026 | 0.073 | 0.127 | 0.027 | 0.079 |
| 24/11/2020-14:23:06 | -0.009 | 0.088 | -0.024 | -0.01 | 0 | -0.01 | -0.072 | -0.03 | 0.027 | 0.059 | -0.002 | 0.018 |
| 24/11/2020-14:30:54 | -0.019 | 0.038 | 0.031 | 0.025 | 0 | 0.052 | 0.001 | 0.021 | 0.029 | 0.093 | 0.015 | 0.038 |
| 24/11/2020-14:38:41 | 0.012 | -0.002 | 0.032 | 0.025 | 0 | -0.005 | -0.014 | 0.008 | 0.062 | 0.118 | 0.042 | 0.078 |
| 24/11/2020-14:46:29 | 0.005 | 0.116 | 0.035 | 0.053 | 0 | 0.034 | 0.024 | 0.013 | 0.019 | 0.133 | 0.037 | 0.103 |
| 24/11/2020-14:54:16 | 0.024 | 0.062 | 0.031 | 0.024 | 0 | 0.023 | 0.021 | 0.006 | 0.087 | 0.173 | 0.018 | 0.089 |
| 24/11/2020-15:02:03 | 0.037 | 0.106 | 0.064 | 0.042 | 0 | 0.058 | 0.016 | 0.045 | 0.084 | 0.16 | 0.083 | 0.154 |
| 24/11/2020-15:09:51 | 0.07 | 0.101 | 0.056 | 0.025 | 0 | 0.062 | 0.045 | 0.029 | 0.046 | 0.139 | 0.053 | 0.069 |
| 24/11/2020-15:17:38 | 0.012 | 0.051 | 0.046 | 0.035 | 0 | 0.066 | 0.077 | 0.061 | 0.093 | 0.18 | 0.041 | 0.105 |
| 24/11/2020-15:25:25 | 0.067 | 0.016 | 0 | -0.003 | 0 | -0.02 | -0.039 | 0.007 | -0.034 | 0.146 | -0.006 | 0.078 |
| 24/11/2020-15:33:13 | 0.001 | -0.055 | -0.02 | -0.017 | 0 | 0.023 | -0.038 | 0 | 0.001 | 0.08 | -0.04 | 0.058 |
| 24/11/2020-15:41:00 | 0.004 | -0.001 | 0.009 | 0.023 | 0 | 0.012 | -0.054 | 0.022 | 0.037 | 0.145 | 0.039 | 0.042 |
| 24/11/2020-15:48:47 | 0.029 | 0.026 | 0.062 | 0.036 | -0.001 | 0.071 | -0.015 | 0.047 | 0.038 | 0.077 | -0.019 | -0.005 |
| 24/11/2020-15:56:35 | -0.075 | 0.013 | -0.007 | -0.006 | 0 | -0.027 | -0.073 | -0.016 | 0.055 | 0.064 | -0.037 | 0.055 |
| 24/11/2020-16:04:22 | -0.007 | 0.005 | 0.037 | 0.033 | 0 | 0.069 | 0.004 | 0.016 | 0.058 | 0.087 | 0 | 0.025 |
| 24/11/2020-16:12:10 | -0.059 | -0.032 | 0.004 | 0.023 | 0 | 0.057 | 0.008 | 0.002 | 0.049 | 0.14 | 0.025 | -0.012 |
| 24/11/2020-16:19:57 | -0.039 | 0.042 | 0.038 | 0.028 | 0 | 0.028 | 0.003 | 0.006 | 0.063 | 0.113 | 0.031 | 0.076 |
| 24/11/2020-16:27:45 | -0.004 | 0.076 | 0.087 | 0.094 | 0 | 0.083 | 0.054 | 0.032 | 0.09 | 0.122 | 0.023 | 0.171 |
| 24/11/2020-16:35:32 | 0 | 0.079 | 0.053 | 0.056 | 0 | 0.057 | 0.005 | -0.001 | 0.055 | 0.115 | 0.015 | -0.006 |
| 24/11/2020-16:43:19 | -0.029 | -0.046 | 0.017 | 0.045 | 0 | 0.058 | -0.007 | 0.05 | 0.122 | 0.139 | 0.041 | 0.104 |
| 24/11/2020-16:51:07 | 0.05 | 0.051 | 0.061 | 0.076 | 0 | 0.036 | -0.019 | 0.03 | 0.031 | 0.109 | 0.026 | 0.082 |
| 24/11/2020-16:58:54 | 0.066 | 0.048 | 0.068 | 0.069 | 0 | 0.027 | 0.009 | 0.016 | 0.072 | 0.1 | 0.035 | 0.122 |
| 24/11/2020-17:06:41 | 0.028 | -0.002 | 0.001 | 0.029 | 0 | 0.023 | -0.077 | 0.026 | 0.054 | 0.114 | 0.021 | 0.061 |
| 24/11/2020-17:14:29 | -0.043 | 0.001 | -0.002 | 0.027 | 0 | 0.008 | -0.035 | 0.018 | 0.039 | 0.083 | 0.009 | 0.085 |
| 24/11/2020-17:22:16 | 0.006 | 0.019 | 0.018 | 0.048 | 0 | 0.053 | 0.065 | 0.029 | 0.064 | 0.09 | 0.041 | 0.11 |
| 24/11/2020-17:30:04 | -0.007 | 0.034 | 0.055 | 0.023 | 0 | 0.049 | 0.041 | 0.038 | 0.036 | 0.071 | 0.026 | 0.108 |
| 24/11/2020-17:37:51 | -0.004 | 0.033 | 0.044 | 0.046 | 0 | 0.053 | 0.022 | 0.04 | 0.047 | 0.08 | 0.026 | 0.084 |
| 24/11/2020-17:45:48 | -0.037 | -0.002 | 0.021 | 0.011 | 0 | 0.031 | -0.041 | -0.006 | 0.017 | 0.026 | 0.014 | 0.098 |
| 24/11/2020-17:53:36 | -0.038 | 0 | 0.012 | 0.023 | 0 | 0.053 | -0.071 | 0.038 | 0.048 | 0.083 | 0.011 | 0.098 |
| 24/11/2020-18:01:23 | 0.047 | 0.048 | 0.042 | 0.033 | 0 | 0.045 | -0.04 | 0.057 | 0.118 | 0.092 | -0.018 | 0.142 |
| 24/11/2020-18:09:10 | 0.062 | 0.026 | 0.035 | 0.038 | 0 | 0.011 | -0.029 | 0.048 | 0.104 | 0.103 | -0.007 | 0.105 |
| 24/11/2020-18:16:58 | 0.02 | 0.005 | 0.004 | 0.013 | 0 | 0.01 | -0.025 | -0.011 | 0.059 | 0.042 | -0.035 | 0.053 |
| 24/11/2020-18:24:45 | -0.029 | -0.02 | -0.014 | 0 | 0 | 0.011 | -0.066 | -0.016 | 0.006 | 0.054 | -0.072 | 0.026 |
| 24/11/2020-18:32:33 | -0.014 | -0.061 | -0.027 | -0.063 | 0 | -0.026 | -0.022 | -0.024 | -0.039 | 0.008 | -0.072 | -0.018 |
| 24/11/2020-18:40:20 | -0.032 | -0.117 | -0.034 | -0.038 | 0 | -0.027 | -0.06 | -0.058 | -0.062 | 0.003 | -0.074 | 0.003 |
| 24/11/2020-18:48:07 | -0.03 | -0.165 | -0.123 | -0.106 | 0 | -0.136 | -0.124 | -0.093 | -0.071 | -0.044 | -0.149 | -0.04 |
| 24/11/2020-18:55:55 | -0.071 | -0.151 | -0.115 | -0.084 | 0 | -0.119 | -0.116 | -0.091 | -0.073 | -0.011 | -0.103 | -0.069 |
| 24/11/2020-19:03:42 | -0.027 | -0.133 | -0.105 | -0.092 | 0 | -0.083 | -0.192 | -0.083 | -0.059 | 0.002 | -0.088 | -0.056 |
| 24/11/2020-19:11:29 | -0.036 | -0.119 | -0.072 | -0.094 | 0 | -0.052 | -0.045 | -0.059 | -0.026 | 0.016 | -0.088 | -0.05 |
| 24/11/2020-19:19:17 | 0 | -0.046 | 0.011 | -0.023 | 0 | -0.04 | 0 | -0.042 | 0.03 | 0.095 | -0.057 | -0.02 |
| 24/11/2020-19:27:04 | -0.066 | -0.062 | -0.066 | -0.079 | 0 | -0.035 | -0.019 | -0.008 | 0.016 | 0.046 | -0.055 | 0.041 |
| 24/11/2020-19:34:51 | -0.042 | -0.049 | 0.02 | -0.017 | 0 | -0.042 | -0.043 | -0.042 | 0.012 | 0.014 | -0.055 | -0.109 |
| 24/11/2020-19:42:39 | -0.035 | -0.059 | -0.044 | -0.016 | 0 | -0.023 | -0.063 | -0.044 | -0.015 | 0.002 | -0.072 | -0.055 |
| 24/11/2020-19:50:26 | -0.073 | -0.109 | -0.087 | -0.073 | 0 | -0.081 | -0.135 | -0.082 | -0.059 | 0.001 | -0.051 | -0.016 |
| 24/11/2020-19:58:13 | -0.07 | -0.135 | -0.092 | -0.096 | 0 | -0.075 | -0.075 | -0.073 | -0.063 | -0.016 | -0.049 | -0.014 |
| 24/11/2020-20:06:01 | -0.012 | -0.02 | -0.1 | -0.012 | 0 | -0.086 | -0.068 | -0.028 | -0.055 | -0.011 | -0.025 | -0.063 |
| 24/11/2020-20:13:48 | -0.022 | -0.062 | -0.083 | 0 | 0 | -0.044 | -0.016 | -0.057 | -0.05 | 0.001 | -0.049 | -0.035 |
| 24/11/2020-20:21:36 | -0.117 | -0.086 | -0.083 | -0.015 | 0 | -0.12 | -0.115 | -0.07 | -0.07 | -0.023 | -0.064 | 0.003 |
| 24/11/2020-20:29:23 | -0.112 | -0.051 | -0.042 | -0.01 | 0 | -0.071 | -0.062 | -0.07 | -0.065 | 0.044 | -0.037 | 0.073 |
| 24/11/2020-20:37:10 | -0.084 | -0.008 | -0.045 | -0.037 | 0 | -0.051 | -0.02 | -0.024 | -0.005 | 0.033 | -0.019 | -0.006 |
| 24/11/2020-20:44:57 | -0.112 | -0.066 | -0.053 | -0.046 | 0 | -0.078 | -0.038 | -0.027 | 0.013 | -0.004 | -0.008 | 0.025 |
| 24/11/2020-20:52:45 | -0.07 | -0.069 | -0.041 | 0.007 | 0 | -0.045 | -0.01 | -0.026 | -0.037 | 0.022 | -0.017 | 0.097 |
| 24/11/2020-21:00:32 | -0.074 | -0.082 | -0.012 | -0.041 | 0 | -0.046 | -0.044 | -0.021 | -0.034 | 0.051 | -0.013 | 0 |
| 24/11/2020-21:08:19 | -0.139 | -0.097 | -0.063 | -0.098 | 0 | -0.026 | -0.03 | -0.025 | -0.059 | -0.008 | 0.004 | 0.023 |
| 24/11/2020-21:16:07 | -0.102 | -0.079 | -0.024 | -0.035 | 0 | -0.057 | -0.096 | -0.008 | 0.002 | 0.051 | 0.011 | 0.038 |
| 24/11/2020-21:23:54 | -0.125 | -0.04 | -0.059 | -0.065 | 0 | -0.044 | -0.09 | -0.029 | -0.035 | 0.008 | -0.039 | -0.052 |
| 24/11/2020-21:31:41 | -0.149 | -0.067 | -0.025 | -0.053 | 0 | -0.022 | -0.063 | 0.016 | 0.002 | 0.018 | -0.039 | 0.065 |
| 24/11/2020-21:39:29 | -0.096 | -0.057 | -0.075 | -0.118 | 0 | 0.009 | 0.001 | 0.004 | -0.004 | 0.069 | -0.014 | 0.058 |
| 24/11/2020-21:47:16 | -0.101 | -0.032 | 0.026 | -0.042 | 0 | 0 | 0.013 | 0.022 | 0.003 | 0.024 | -0.013 | 0.017 |
| 24/11/2020-21:55:03 | -0.085 | -0.024 | -0.035 | -0.043 | 0 | 0.004 | -0.033 | 0.027 | -0.018 | 0.078 | 0.046 | 0.065 |
| 24/11/2020-22:02:51 | -0.024 | 0 | 0.008 | -0.021 | 0 | 0.009 | 0.014 | 0.056 | 0.017 | 0.104 | 0.028 | 0.058 |
| 24/11/2020-22:10:38 | -0.038 | -0.004 | -0.02 | -0.037 | 0 | -0.001 | 0.003 | 0.007 | -0.026 | 0.047 | -0.009 | 0.067 |
| 24/11/2020-22:18:25 | -0.061 | -0.061 | -0.073 | -0.086 | 0 | -0.026 | -0.047 | -0.037 | -0.058 | 0.023 | -0.022 | 0.023 |
| 24/11/2020-22:26:13 | -0.116 | -0.089 | -0.068 | -0.082 | 0 | -0.052 | -0.075 | -0.037 | -0.029 | 0.035 | -0.034 | 0.027 |
| 24/11/2020-22:34:00 | -0.18 | -0.106 | -0.123 | -0.077 | 0 | -0.039 | -0.036 | 0 | -0.057 | 0.022 | -0.034 | 0.041 |
| 24/11/2020-22:41:47 | -0.107 | -0.126 | -0.075 | -0.099 | 0 | -0.078 | -0.012 | -0.056 | -0.047 | 0.038 | -0.017 | -0.03 |
| 24/11/2020-22:49:35 | -0.101 | -0.02 | -0.068 | -0.071 | 0 | -0.08 | -0.029 | -0.049 | -0.045 | 0.006 | -0.068 | -0.056 |
| 24/11/2020-22:57:22 | -0.139 | -0.096 | -0.113 | -0.051 | 0 | -0.062 | -0.063 | -0.034 | -0.038 | 0.03 | -0.019 | 0.029 |
| 24/11/2020-23:05:10 | -0.123 | -0.083 | -0.082 | -0.03 | 0 | -0.057 | -0.081 | -0.052 | -0.048 | 0.031 | -0.048 | 0.014 |
| 24/11/2020-23:12:57 | -0.115 | -0.083 | -0.07 | -0.098 | 0 | -0.048 | -0.112 | -0.033 | -0.045 | 0.021 | -0.048 | 0.053 |
| 24/11/2020-23:20:44 | -0.096 | -0.054 | -0.033 | -0.069 | 0 | -0.033 | -0.063 | -0.078 | -0.053 | 0.055 | -0.046 | 0.034 |
| 24/11/2020-23:28:32 | -0.107 | -0.104 | -0.091 | -0.066 | 0 | -0.018 | 0.024 | -0.07 | -0.029 | 0.076 | -0.046 | 0.062 |
| 24/11/2020-23:36:19 | -0.131 | -0.089 | -0.079 | -0.081 | 0 | -0.058 | -0.03 | -0.004 | -0.004 | 0.018 | -0.036 | 0.057 |
| 24/11/2020-23:44:06 | -0.099 | -0.037 | -0.091 | -0.033 | 0 | -0.039 | -0.067 | -0.017 | -0.007 | 0.024 | -0.014 | 0.049 |
| 24/11/2020-23:51:54 | -0.114 | -0.096 | -0.054 | -0.045 | 0 | -0.015 | -0.075 | -0.039 | -0.02 | 0.062 | -0.005 | 0.081 |
| 24/11/2020-23:59:41 | -0.135 | -0.085 | -0.088 | -0.045 | 0 | -0.091 | -0.145 | -0.073 | -0.103 | 0.051 | -0.067 | 0.042 |
| 25/11/2020-00:07:28 | -0.138 | -0.124 | -0.132 | -0.105 | 0 | -0.1 | -0.111 | -0.076 | -0.079 | 0.013 | -0.04 | -0.022 |
| 25/11/2020-00:15:26 | -0.126 | -0.124 | -0.122 | -0.095 | 0 | -0.067 | -0.086 | -0.061 | -0.046 | 0.011 | -0.083 | -0.062 |
| 25/11/2020-00:23:14 | -0.161 | -0.075 | -0.115 | -0.078 | 0 | -0.086 | -0.035 | -0.088 | -0.112 | 0.042 | -0.098 | 0.014 |
| 25/11/2020-00:31:01 | -0.166 | -0.102 | -0.113 | -0.128 | 0 | -0.08 | -0.04 | -0.051 | -0.019 | 0.068 | -0.025 | 0.036 |
| 25/11/2020-00:38:48 | -0.116 | -0.02 | -0.053 | -0.02 | 0 | -0.058 | -0.024 | -0.025 | -0.024 | 0.06 | -0.036 | 0.026 |
| 25/11/2020-00:46:36 | -0.106 | -0.033 | -0.082 | -0.076 | 0 | -0.067 | -0.045 | -0.047 | -0.04 | 0.079 | -0.036 | 0.034 |
| 25/11/2020-00:54:23 | -0.119 | -0.054 | -0.108 | -0.076 | 0 | -0.068 | -0.056 | -0.054 | -0.029 | 0.06 | -0.032 | 0.065 |
| 25/11/2020-01:02:10 | -0.096 | -0.053 | -0.091 | -0.09 | 0 | -0.105 | -0.054 | -0.094 | -0.068 | 0.011 | -0.032 | 0.011 |
| 25/11/2020-01:09:58 | -0.118 | -0.1 | -0.096 | -0.1 | 0 | -0.057 | -0.022 | -0.04 | -0.007 | 0.058 | -0.041 | 0.08 |
| 25/11/2020-01:17:45 | -0.123 | -0.02 | -0.111 | -0.083 | 0 | -0.086 | -0.04 | -0.051 | -0.024 | 0.071 | -0.041 | 0.014 |
| 25/11/2020-01:25:32 | -0.117 | -0.018 | -0.074 | -0.088 | 0 | -0.064 | 0.01 | -0.01 | -0.001 | 0.094 | -0.012 | 0.071 |
| 25/11/2020-01:33:20 | -0.122 | -0.026 | -0.074 | -0.092 | 0 | -0.074 | 0.048 | -0.027 | 0 | 0.057 | -0.016 | 0.074 |
| 25/11/2020-01:41:07 | -0.164 | -0.018 | -0.075 | -0.095 | 0 | -0.067 | -0.037 | -0.08 | -0.005 | 0.049 | -0.019 | 0 |
| 25/11/2020-01:48:54 | -0.129 | -0.062 | -0.107 | -0.119 | 0 | -0.057 | -0.008 | -0.042 | -0.043 | 0.047 | -0.049 | -0.009 |
| 25/11/2020-01:56:41 | -0.158 | -0.056 | -0.122 | -0.112 | 0 | -0.106 | -0.035 | -0.064 | -0.026 | 0.101 | 0.005 | 0.023 |
| 25/11/2020-02:04:29 | -0.173 | -0.048 | -0.104 | -0.122 | 0 | -0.077 | -0.041 | -0.041 | -0.047 | 0.079 | -0.012 | 0.035 |
| 25/11/2020-02:12:16 | -0.144 | -0.045 | -0.098 | -0.093 | 0 | -0.07 | -0.014 | -0.027 | -0.043 | 0.061 | -0.024 | 0.015 |
| 25/11/2020-02:20:03 | -0.152 | -0.073 | -0.059 | -0.024 | 0 | -0.044 | 0.008 | 0.009 | 0.019 | 0.097 | -0.013 | -0.041 |
| 25/11/2020-02:27:51 | -0.115 | -0.038 | -0.087 | -0.11 | 0 | -0.121 | -0.054 | -0.05 | -0.045 | 0.117 | -0.029 | -0.032 |
| 25/11/2020-02:35:38 | -0.149 | -0.099 | -0.11 | -0.132 | 0 | -0.098 | -0.089 | -0.071 | -0.072 | 0.001 | -0.028 | -0.003 |
| 25/11/2020-02:43:25 | -0.171 | -0.053 | -0.1 | -0.121 | 0 | -0.074 | -0.078 | -0.064 | -0.053 | 0.036 | -0.025 | -0.075 |
| 25/11/2020-02:51:13 | -0.184 | -0.04 | -0.116 | -0.132 | 0 | -0.085 | -0.056 | -0.04 | -0.05 | 0.067 | -0.036 | 0.011 |
| 25/11/2020-02:59:00 | -0.154 | -0.027 | -0.088 | -0.057 | 0 | -0.09 | -0.096 | -0.079 | -0.062 | 0.057 | -0.074 | -0.069 |
| 25/11/2020-03:06:48 | -0.157 | -0.133 | -0.119 | -0.1 | 0 | -0.103 | -0.129 | -0.105 | -0.039 | 0.008 | -0.074 | -0.015 |
| 25/11/2020-03:14:35 | -0.21 | -0.129 | -0.135 | -0.136 | 0 | -0.107 | -0.149 | -0.111 | -0.067 | -0.045 | -0.058 | 0.002 |
| 25/11/2020-03:22:22 | -0.215 | -0.123 | -0.125 | -0.101 | 0 | -0.081 | -0.128 | -0.076 | -0.025 | -0.004 | -0.042 | 0.01 |
| 25/11/2020-03:30:09 | -0.189 | -0.088 | -0.15 | -0.092 | 0 | -0.079 | -0.101 | -0.064 | -0.054 | 0.001 | -0.069 | -0.037 |
| 25/11/2020-03:37:57 | -0.228 | -0.087 | -0.119 | -0.134 | 0 | -0.13 | -0.08 | -0.114 | -0.092 | -0.006 | -0.086 | 0.028 |